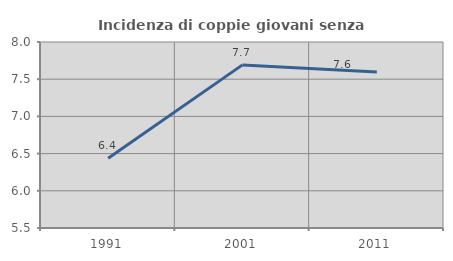
| Category | Incidenza di coppie giovani senza figli |
|---|---|
| 1991.0 | 6.436 |
| 2001.0 | 7.692 |
| 2011.0 | 7.597 |